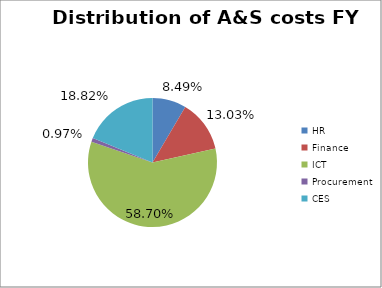
| Category | Distribution of A&S costs FY 2016/17 |
|---|---|
| HR | 0.085 |
| Finance | 0.13 |
| ICT | 0.587 |
| Procurement | 0.01 |
| CES | 0.188 |